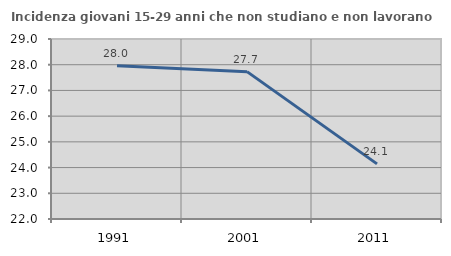
| Category | Incidenza giovani 15-29 anni che non studiano e non lavorano  |
|---|---|
| 1991.0 | 27.962 |
| 2001.0 | 27.731 |
| 2011.0 | 24.143 |